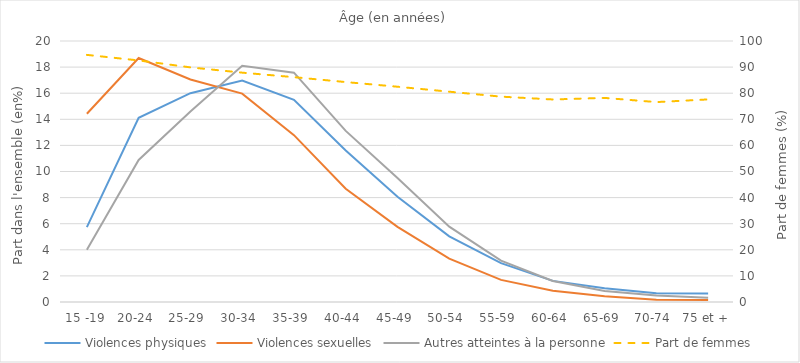
| Category | Violences physiques | Violences sexuelles | Autres atteintes à la personne |
|---|---|---|---|
| 15 -19 | 5.736 | 14.426 | 3.995 |
| 20-24  | 14.121 | 18.696 | 10.888 |
| 25-29  | 16.003 | 17.054 | 14.598 |
| 30-34  | 16.963 | 15.968 | 18.097 |
| 35-39  | 15.492 | 12.784 | 17.573 |
| 40-44  | 11.614 | 8.679 | 13.113 |
| 45-49  | 8.061 | 5.76 | 9.503 |
| 50-54  | 5.034 | 3.322 | 5.772 |
| 55-59  | 2.98 | 1.693 | 3.165 |
| 60-64  | 1.619 | 0.859 | 1.615 |
| 65-69  | 1.046 | 0.442 | 0.851 |
| 70-74  | 0.678 | 0.164 | 0.504 |
| 75 et + | 0.653 | 0.152 | 0.325 |